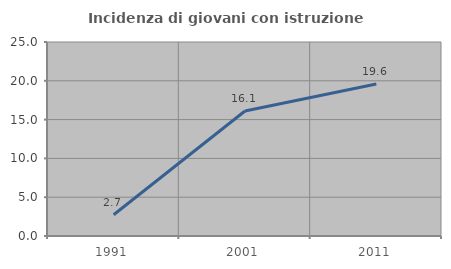
| Category | Incidenza di giovani con istruzione universitaria |
|---|---|
| 1991.0 | 2.734 |
| 2001.0 | 16.109 |
| 2011.0 | 19.592 |